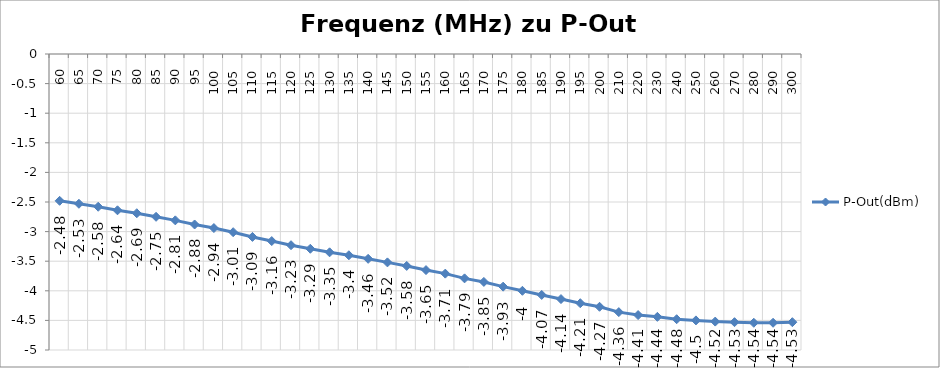
| Category | P-Out(dBm) |
|---|---|
| 60.0 | -2.48 |
| 65.0 | -2.53 |
| 70.0 | -2.58 |
| 75.0 | -2.64 |
| 80.0 | -2.69 |
| 85.0 | -2.75 |
| 90.0 | -2.81 |
| 95.0 | -2.88 |
| 100.0 | -2.94 |
| 105.0 | -3.01 |
| 110.0 | -3.09 |
| 115.0 | -3.16 |
| 120.0 | -3.23 |
| 125.0 | -3.29 |
| 130.0 | -3.35 |
| 135.0 | -3.4 |
| 140.0 | -3.46 |
| 145.0 | -3.52 |
| 150.0 | -3.58 |
| 155.0 | -3.65 |
| 160.0 | -3.71 |
| 165.0 | -3.79 |
| 170.0 | -3.85 |
| 175.0 | -3.93 |
| 180.0 | -4 |
| 185.0 | -4.07 |
| 190.0 | -4.14 |
| 195.0 | -4.21 |
| 200.0 | -4.27 |
| 210.0 | -4.36 |
| 220.0 | -4.41 |
| 230.0 | -4.44 |
| 240.0 | -4.48 |
| 250.0 | -4.5 |
| 260.0 | -4.52 |
| 270.0 | -4.53 |
| 280.0 | -4.54 |
| 290.0 | -4.54 |
| 300.0 | -4.53 |